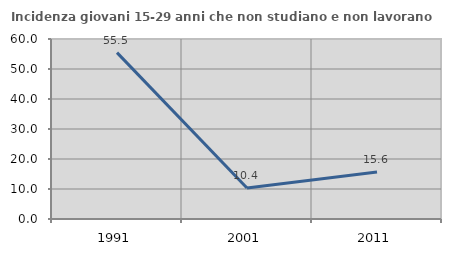
| Category | Incidenza giovani 15-29 anni che non studiano e non lavorano  |
|---|---|
| 1991.0 | 55.469 |
| 2001.0 | 10.351 |
| 2011.0 | 15.644 |